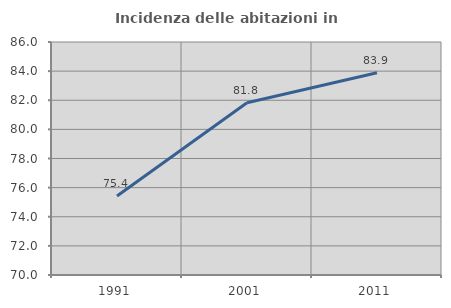
| Category | Incidenza delle abitazioni in proprietà  |
|---|---|
| 1991.0 | 75.43 |
| 2001.0 | 81.83 |
| 2011.0 | 83.892 |